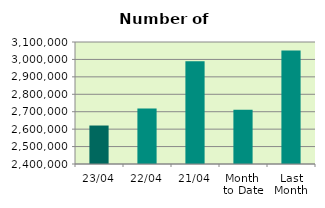
| Category | Series 0 |
|---|---|
| 23/04 | 2620774 |
| 22/04 | 2718476 |
| 21/04 | 2989624 |
| Month 
to Date | 2711090.933 |
| Last
Month | 3050763.217 |